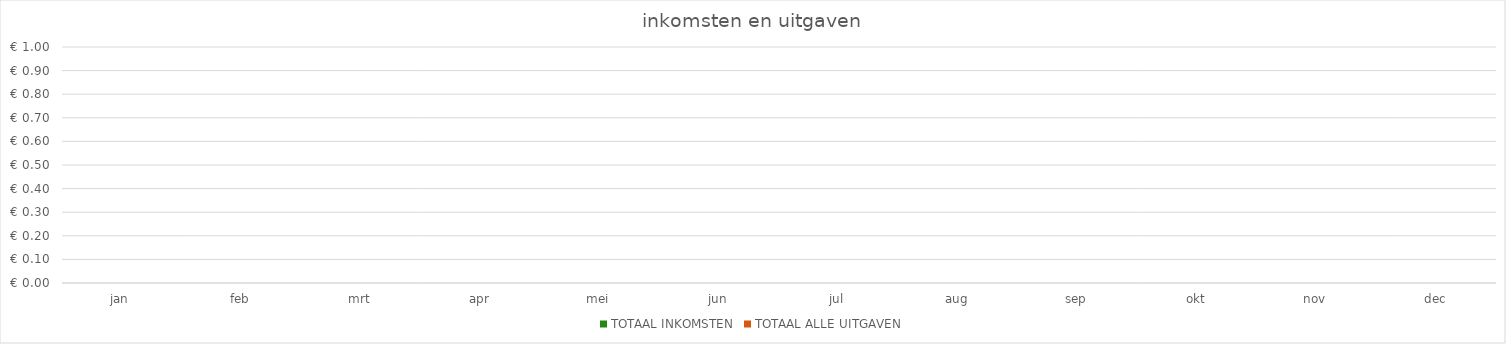
| Category | TOTAAL INKOMSTEN | TOTAAL ALLE UITGAVEN |
|---|---|---|
| jan | 0 | 0 |
| feb | 0 | 0 |
| mrt | 0 | 0 |
| apr | 0 | 0 |
| mei | 0 | 0 |
| jun | 0 | 0 |
| jul | 0 | 0 |
| aug | 0 | 0 |
| sep | 0 | 0 |
| okt | 0 | 0 |
| nov | 0 | 0 |
| dec | 0 | 0 |